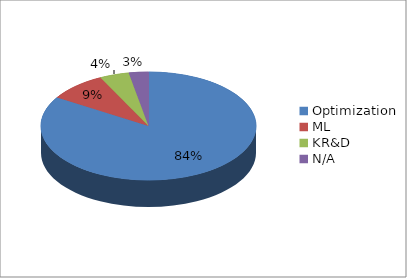
| Category | Series 0 |
|---|---|
| Optimization | 57 |
| ML | 6 |
| KR&D | 3 |
| N/A | 2 |